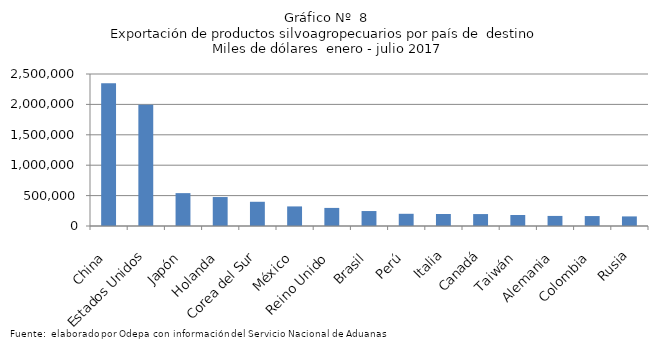
| Category | Series 0 |
|---|---|
| China | 2348365.224 |
| Estados Unidos | 1995887.896 |
| Japón | 540556.178 |
| Holanda | 476338.582 |
| Corea del Sur | 398380.223 |
| México | 322007.178 |
| Reino Unido | 297455.762 |
| Brasil | 246083.256 |
| Perú | 200844.064 |
| Italia | 197829.234 |
| Canadá | 196227.614 |
| Taiwán | 180801.689 |
| Alemania | 165687.36 |
| Colombia | 163482.082 |
| Rusia | 157738.378 |